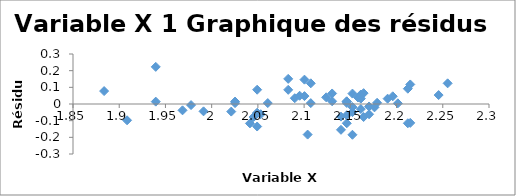
| Category | Series 0 |
|---|---|
| 1.9084850188786497 | -0.098 |
| 1.8836614351536174 | 0.078 |
| 1.9395192526186182 | 0.014 |
| 1.968482948553935 | -0.038 |
| 1.9912260756924949 | -0.044 |
| 1.9777236052888476 | -0.006 |
| 2.049218022670181 | -0.135 |
| 2.041392685158225 | -0.116 |
| 2.021189299069938 | -0.046 |
| 2.045322978786657 | -0.078 |
| 2.02530586526477 | 0.005 |
| 2.0530784434834195 | -0.061 |
| 2.103803720955957 | -0.183 |
| 2.049218022670181 | -0.052 |
| 2.02530586526477 | 0.015 |
| 1.9395192526186182 | 0.223 |
| 2.0606978403536114 | 0.006 |
| 2.1522883443830563 | -0.185 |
| 2.1398790864012365 | -0.155 |
| 2.049218022670181 | 0.086 |
| 2.1461280356782377 | -0.116 |
| 2.0899051114393976 | 0.035 |
| 2.1398790864012365 | -0.076 |
| 2.107209969647868 | 0.005 |
| 2.0951693514317546 | 0.05 |
| 2.08278537031645 | 0.085 |
| 2.1461280356782377 | -0.067 |
| 2.1003705451175625 | 0.047 |
| 2.1643528557844367 | -0.078 |
| 2.1522883443830563 | -0.049 |
| 2.130333768495006 | 0.016 |
| 2.123851640967086 | 0.04 |
| 2.1522883443830563 | -0.018 |
| 2.170261715394957 | -0.062 |
| 2.08278537031645 | 0.151 |
| 2.1461280356782377 | 0.006 |
| 2.1613680022349744 | -0.03 |
| 2.1461280356782377 | 0.016 |
| 2.1461280356782377 | 0.016 |
| 2.130333768495006 | 0.063 |
| 2.107209969647868 | 0.124 |
| 2.1003705451175625 | 0.146 |
| 2.170261715394957 | -0.015 |
| 2.2121876044039577 | -0.116 |
| 2.214843848047698 | -0.113 |
| 2.176091259055681 | -0.02 |
| 2.1583624920952493 | 0.039 |
| 2.1613680022349744 | 0.032 |
| 2.1522883443830563 | 0.062 |
| 2.1789769472931693 | 0.007 |
| 2.1613680022349744 | 0.057 |
| 2.1643528557844367 | 0.065 |
| 2.2013971243204513 | 0.004 |
| 2.1903316981702914 | 0.032 |
| 2.1958996524092336 | 0.046 |
| 2.2121876044039577 | 0.092 |
| 2.214843848047698 | 0.117 |
| 2.2455126678141495 | 0.054 |
| 2.255272505103306 | 0.124 |